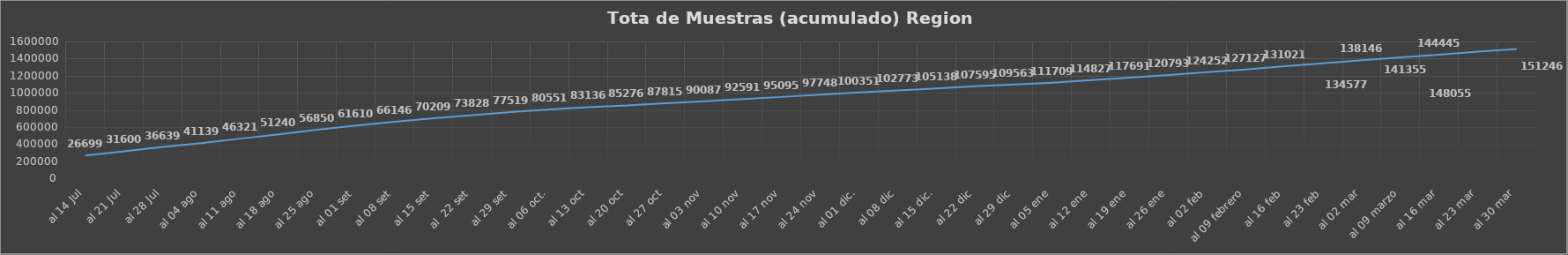
| Category | Series 0 |
|---|---|
| al 14 Jul | 266999 |
| al 21 Jul | 316006 |
| al 28 Jul | 366390 |
| al 04 ago | 411395 |
| al 11 ago | 463219 |
| al 18 ago | 512400 |
| al 25 ago | 568508 |
| al 01 set | 616104 |
| al 08 set | 661464 |
| al 15 set | 702099 |
| al  22 set | 738280 |
| al 29 set | 775193 |
| al 06 oct. | 805516 |
| al 13 oct | 831368 |
| al 20 oct | 852760 |
| al 27 oct | 878156 |
| al 03 nov | 900872 |
| al 10 nov | 925918 |
| al 17 nov | 950955 |
| al 24 nov | 977488 |
| al 01 dic. | 1003514 |
| al 08 dic | 1027730 |
| al 15 dic. | 1051385 |
| al 22 dic | 1075955 |
| al 29 dic | 1095633 |
| al 05 ene | 1117099 |
| al 12 ene | 1148275 |
| al 19 ene | 1176918 |
| al 26 ene | 1207933 |
| al 02 feb | 1242522 |
| al 09 febrero | 1271270 |
| al 16 feb | 1310217 |
| al 23 feb | 1345770 |
| al 02 mar | 1381461 |
| al 09 marzo | 1413550 |
| al 16 mar | 1444450 |
| al 23 mar | 1480555 |
| al 30 mar | 1512467 |